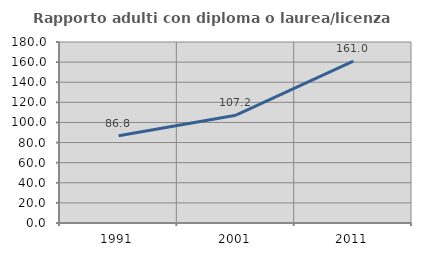
| Category | Rapporto adulti con diploma o laurea/licenza media  |
|---|---|
| 1991.0 | 86.806 |
| 2001.0 | 107.222 |
| 2011.0 | 160.989 |